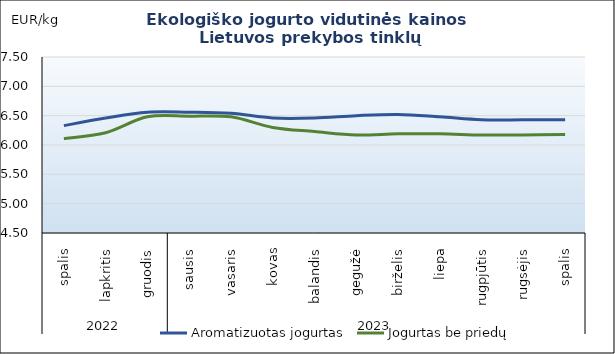
| Category | Aromatizuotas jogurtas | Jogurtas be priedų |
|---|---|---|
| 0 | 6.33 | 6.11 |
| 1 | 6.46 | 6.21 |
| 2 | 6.56 | 6.48 |
| 3 | 6.56 | 6.49 |
| 4 | 6.54 | 6.48 |
| 5 | 6.46 | 6.3 |
| 6 | 6.46 | 6.23 |
| 7 | 6.5 | 6.17 |
| 8 | 6.52 | 6.19 |
| 9 | 6.48 | 6.19 |
| 10 | 6.43 | 6.17 |
| 11 | 6.43 | 6.17 |
| 12 | 6.43 | 6.18 |